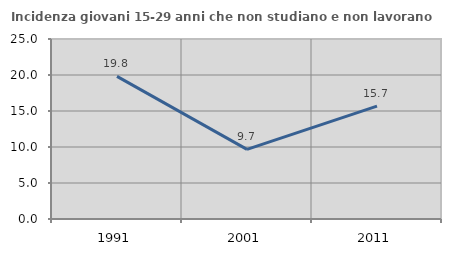
| Category | Incidenza giovani 15-29 anni che non studiano e non lavorano  |
|---|---|
| 1991.0 | 19.811 |
| 2001.0 | 9.677 |
| 2011.0 | 15.686 |